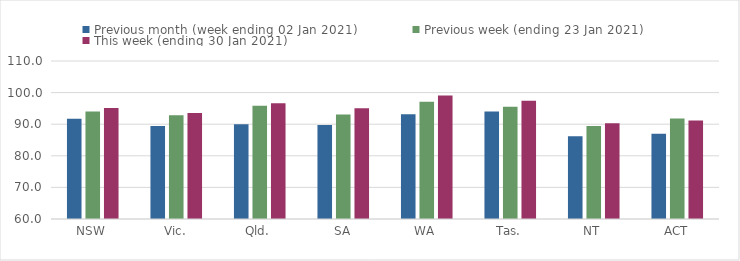
| Category | Previous month (week ending 02 Jan 2021) | Previous week (ending 23 Jan 2021) | This week (ending 30 Jan 2021) |
|---|---|---|---|
| NSW | 91.75 | 93.98 | 95.14 |
| Vic. | 89.46 | 92.81 | 93.57 |
| Qld. | 89.99 | 95.83 | 96.65 |
| SA | 89.74 | 93.06 | 95.07 |
| WA | 93.18 | 97.11 | 99.09 |
| Tas. | 94 | 95.5 | 97.41 |
| NT | 86.2 | 89.45 | 90.34 |
| ACT | 86.96 | 91.8 | 91.17 |